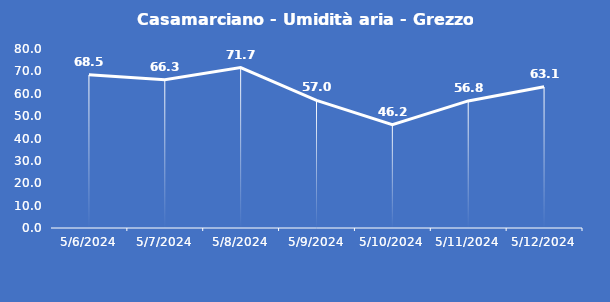
| Category | Casamarciano - Umidità aria - Grezzo (%) |
|---|---|
| 5/6/24 | 68.5 |
| 5/7/24 | 66.3 |
| 5/8/24 | 71.7 |
| 5/9/24 | 57 |
| 5/10/24 | 46.2 |
| 5/11/24 | 56.8 |
| 5/12/24 | 63.1 |